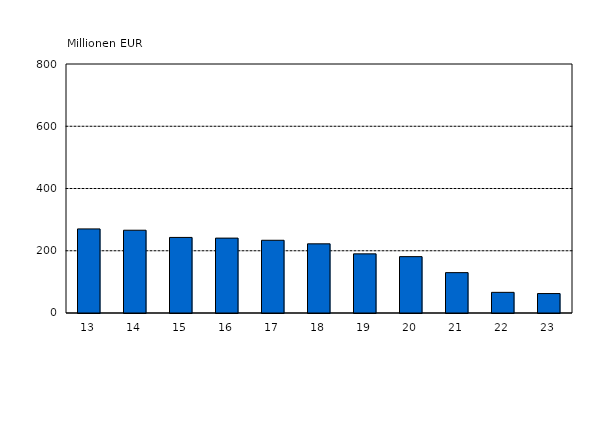
| Category | Series 0 |
|---|---|
| 13 | 270.163 |
| 14 | 265.964 |
| 15 | 242.807 |
| 16 | 240.567 |
| 17 | 233.66 |
| 18 | 222.211 |
| 19 | 189.995 |
| 20 | 181.095 |
| 21 | 129.697 |
| 22 | 66.335 |
| 23 | 62.453 |